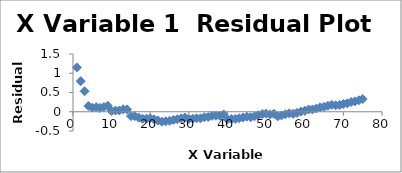
| Category | Series 0 |
|---|---|
| 1.0 | 1.151 |
| 2.0 | 0.795 |
| 3.0 | 0.532 |
| 4.0 | 0.148 |
| 5.0 | 0.106 |
| 6.0 | 0.121 |
| 7.0 | 0.098 |
| 8.0 | 0.125 |
| 9.0 | 0.156 |
| 10.0 | 0.02 |
| 11.0 | 0.032 |
| 12.0 | 0.033 |
| 13.0 | 0.065 |
| 14.0 | 0.061 |
| 15.0 | -0.112 |
| 16.0 | -0.113 |
| 17.0 | -0.153 |
| 18.0 | -0.182 |
| 19.0 | -0.178 |
| 20.0 | -0.169 |
| 21.0 | -0.197 |
| 22.0 | -0.228 |
| 23.0 | -0.257 |
| 24.0 | -0.247 |
| 25.0 | -0.234 |
| 26.0 | -0.211 |
| 27.0 | -0.193 |
| 28.0 | -0.171 |
| 29.0 | -0.151 |
| 30.0 | -0.188 |
| 31.0 | -0.179 |
| 32.0 | -0.171 |
| 33.0 | -0.17 |
| 34.0 | -0.144 |
| 35.0 | -0.136 |
| 36.0 | -0.106 |
| 37.0 | -0.104 |
| 38.0 | -0.102 |
| 39.0 | -0.069 |
| 40.0 | -0.2 |
| 41.0 | -0.188 |
| 42.0 | -0.186 |
| 43.0 | -0.168 |
| 44.0 | -0.15 |
| 45.0 | -0.129 |
| 46.0 | -0.144 |
| 47.0 | -0.118 |
| 48.0 | -0.091 |
| 49.0 | -0.058 |
| 50.0 | -0.049 |
| 51.0 | -0.067 |
| 52.0 | -0.054 |
| 53.0 | -0.12 |
| 54.0 | -0.094 |
| 55.0 | -0.064 |
| 56.0 | -0.042 |
| 57.0 | -0.055 |
| 58.0 | -0.03 |
| 59.0 | 0.004 |
| 60.0 | 0.028 |
| 61.0 | 0.06 |
| 62.0 | 0.06 |
| 63.0 | 0.084 |
| 64.0 | 0.114 |
| 65.0 | 0.127 |
| 66.0 | 0.155 |
| 67.0 | 0.181 |
| 68.0 | 0.168 |
| 69.0 | 0.176 |
| 70.0 | 0.202 |
| 71.0 | 0.22 |
| 72.0 | 0.253 |
| 73.0 | 0.27 |
| 74.0 | 0.297 |
| 75.0 | 0.33 |